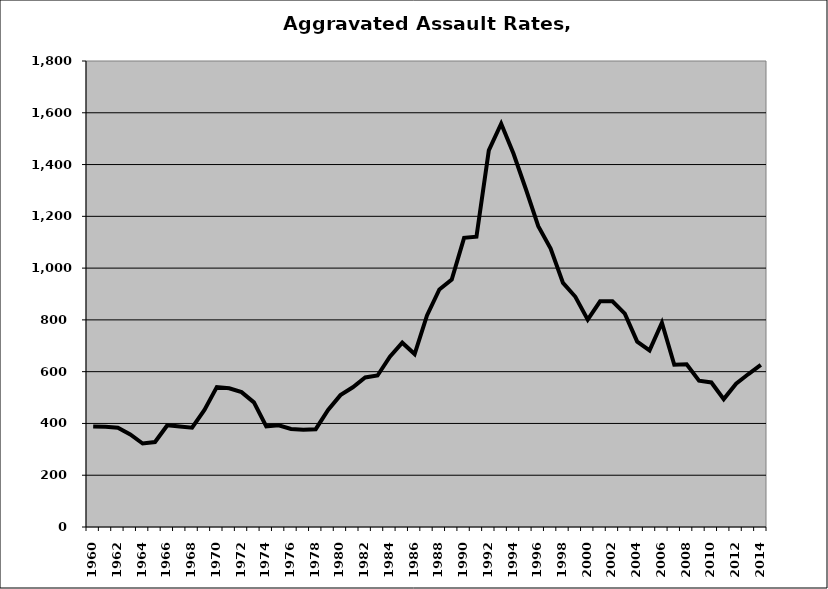
| Category | Aggravated Assault |
|---|---|
| 1960.0 | 388.242 |
| 1961.0 | 386.802 |
| 1962.0 | 383.291 |
| 1963.0 | 357.268 |
| 1964.0 | 322.401 |
| 1965.0 | 328.144 |
| 1966.0 | 393.193 |
| 1967.0 | 388.504 |
| 1968.0 | 383.56 |
| 1969.0 | 452.256 |
| 1970.0 | 540.508 |
| 1971.0 | 536.032 |
| 1972.0 | 520.989 |
| 1973.0 | 481.367 |
| 1974.0 | 388.797 |
| 1975.0 | 392.737 |
| 1976.0 | 378.775 |
| 1977.0 | 375.942 |
| 1978.0 | 377.745 |
| 1979.0 | 451.829 |
| 1980.0 | 509.419 |
| 1981.0 | 539.623 |
| 1982.0 | 577.655 |
| 1983.0 | 585.233 |
| 1984.0 | 657.624 |
| 1985.0 | 711.981 |
| 1986.0 | 667.891 |
| 1987.0 | 817.363 |
| 1988.0 | 917.742 |
| 1989.0 | 956.126 |
| 1990.0 | 1116.988 |
| 1991.0 | 1121.405 |
| 1992.0 | 1454.669 |
| 1993.0 | 1557.612 |
| 1994.0 | 1441.754 |
| 1995.0 | 1304.693 |
| 1996.0 | 1162.063 |
| 1997.0 | 1075.236 |
| 1998.0 | 943.021 |
| 1999.0 | 889.21 |
| 2000.0 | 800.966 |
| 2001.0 | 871.873 |
| 2002.0 | 871.816 |
| 2003.0 | 824.397 |
| 2004.0 | 715.937 |
| 2005.0 | 682.245 |
| 2006.0 | 789.125 |
| 2007.0 | 626.73 |
| 2008.0 | 628.226 |
| 2009.0 | 565.323 |
| 2010.0 | 558.396 |
| 2011.0 | 494.007 |
| 2012.0 | 553.339 |
| 2013.0 | 590.808 |
| 2014.0 | 626.05 |